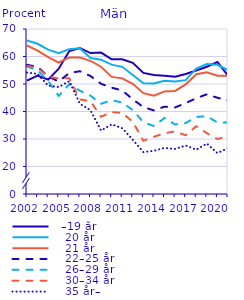
| Category |   –19 år |    20 år |    21 år |    22–25 år |    26–29 år |    30–34 år |    35 år– |
|---|---|---|---|---|---|---|---|
| 2002.0 | 51.212 | 65.829 | 64.003 | 56.957 | 56.382 | 56.591 | 54.152 |
| 2003.0 | 53.096 | 64.626 | 62.113 | 56.272 | 54.926 | 55.904 | 53.676 |
| 2004.0 | 51.565 | 62.514 | 59.756 | 52.738 | 51.136 | 52.656 | 49.42 |
| 2005.0 | 55.574 | 61.192 | 57.809 | 50.883 | 45.679 | 52.004 | 48.896 |
| 2006.0 | 61.978 | 62.672 | 59.675 | 54.04 | 49.979 | 52.08 | 51.039 |
| 2007.0 | 63.101 | 63.007 | 59.625 | 54.635 | 47.558 | 44.406 | 42.808 |
| 2008.0 | 61.259 | 59.429 | 58.402 | 52.905 | 45.759 | 43.708 | 40.443 |
| 2009.0 | 61.441 | 58.846 | 56.277 | 50.078 | 42.805 | 38.107 | 33.085 |
| 2010.0 | 58.991 | 57.04 | 52.59 | 48.666 | 44.141 | 39.755 | 35.336 |
| 2011.0 | 59.008 | 56.249 | 52.05 | 47.644 | 43.256 | 39.483 | 33.913 |
| 2012.0 | 57.674 | 53.294 | 50.046 | 44.45 | 40.506 | 36.253 | 29.718 |
| 2013.0 | 54.028 | 50.279 | 46.665 | 41.58 | 36.093 | 29.371 | 25.254 |
| 2014.0 | 53.267 | 50.21 | 45.722 | 40.392 | 34.723 | 30.802 | 25.717 |
| 2015.0 | 53.033 | 51.151 | 47.308 | 41.761 | 37.641 | 32.096 | 26.764 |
| 2016.0 | 52.612 | 50.949 | 47.491 | 41.475 | 35.283 | 32.786 | 26.386 |
| 2017.0 | 53.666 | 51.411 | 49.852 | 43.056 | 35.787 | 31.356 | 27.622 |
| 2018.0 | 54.927 | 55.633 | 53.571 | 44.846 | 38.034 | 34.653 | 26.108 |
| 2019.0 | 56.266 | 57.26 | 54.238 | 46.253 | 38.292 | 32.103 | 28.341 |
| 2020.0 | 58 | 57 | 53 | 45 | 36 | 30 | 24.891 |
| 2021.0 | 53 | 55 | 53 | 44 | 36 | 31 | 26.658 |